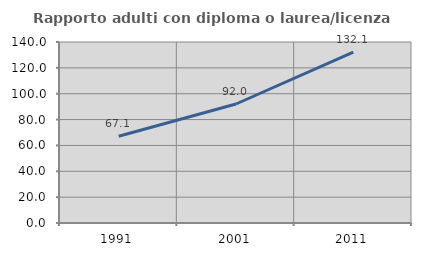
| Category | Rapporto adulti con diploma o laurea/licenza media  |
|---|---|
| 1991.0 | 67.123 |
| 2001.0 | 92.045 |
| 2011.0 | 132.143 |